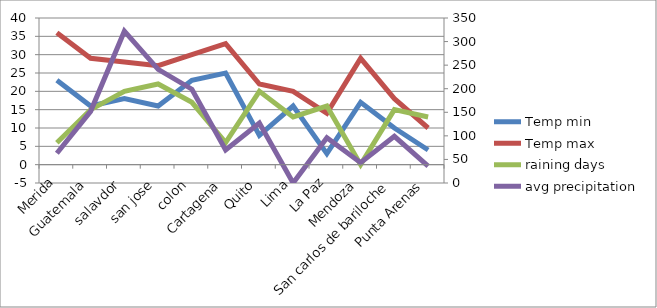
| Category | Temp min | Temp max | raining days |
|---|---|---|---|
| Merida | 23 | 36 | 6 |
| Guatemala | 16 | 29 | 15 |
| salavdor | 18 | 28 | 20 |
| san jose | 16 | 27 | 22 |
| colon | 23 | 30 | 17 |
| Cartagena | 25 | 33 | 6 |
| Quito | 8 | 22 | 20 |
| Lima | 16 | 20 | 13 |
| La Paz | 3 | 14 | 16 |
| Mendoza | 17 | 29 | 0 |
| San carlos de bariloche | 10 | 18 | 15 |
| Punta Arenas | 4 | 10 | 13 |